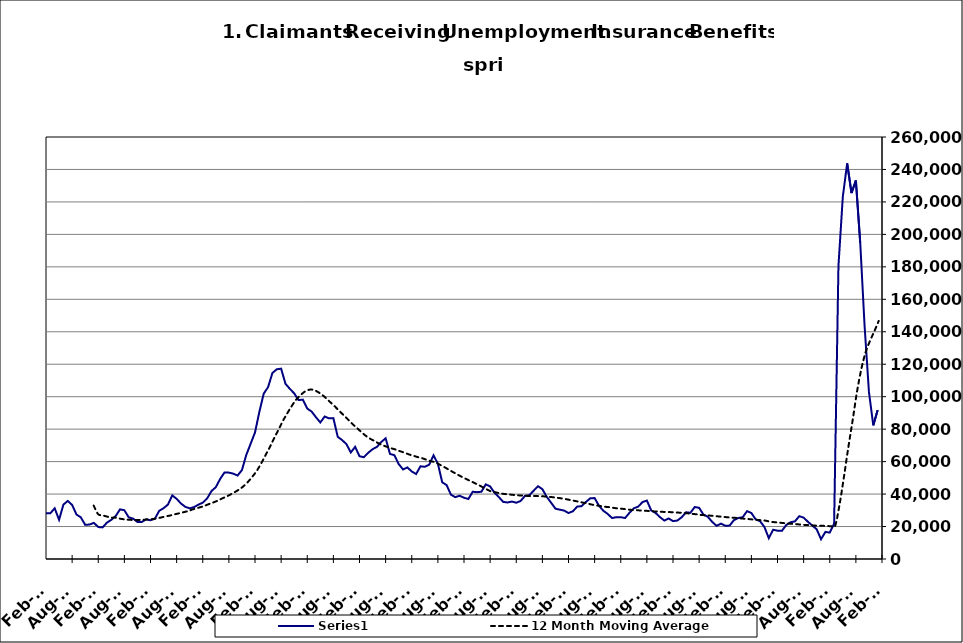
| Category | Series 0 |
|---|---|
| 2000-01-31 | 15239 |
| 2000-02-29 | 13995 |
| 2000-03-31 | 14536 |
| 2000-04-30 | 18337 |
| 2000-05-31 | 20863 |
| 2000-06-30 | 24310 |
| 2000-07-31 | 29359 |
| 2000-08-31 | 29764 |
| 2000-09-30 | 24540 |
| 2000-10-31 | 23067 |
| 2000-11-30 | 21129 |
| 2000-12-31 | 20288 |
| 2001-01-31 | 23646 |
| 2001-02-28 | 23782 |
| 2001-03-31 | 27047 |
| 2001-04-30 | 34048 |
| 2001-05-31 | 38168 |
| 2001-06-30 | 41894 |
| 2001-07-31 | 48114 |
| 2001-08-31 | 47646 |
| 2001-09-30 | 44132 |
| 2001-10-31 | 44465 |
| 2001-11-30 | 45928 |
| 2001-12-31 | 48930 |
| 2002-01-31 | 51864 |
| 2002-02-28 | 50778 |
| 2002-03-31 | 53014 |
| 2002-04-30 | 65394 |
| 2002-05-31 | 67925 |
| 2002-06-30 | 68727 |
| 2002-07-31 | 67269 |
| 2002-08-31 | 64233 |
| 2002-09-30 | 59955 |
| 2002-10-31 | 55535 |
| 2002-11-30 | 52233 |
| 2002-12-31 | 52252 |
| 2003-01-31 | 52694 |
| 2003-02-28 | 52578 |
| 2003-03-31 | 56236 |
| 2003-04-30 | 61020 |
| 2003-05-31 | 60584 |
| 2003-06-30 | 64980 |
| 2003-07-31 | 66426 |
| 2003-08-31 | 65403 |
| 2003-09-30 | 58348 |
| 2003-10-31 | 53953 |
| 2003-11-30 | 50453 |
| 2003-12-31 | 47799 |
| 2004-01-31 | 47134 |
| 2004-02-29 | 42441 |
| 2004-03-31 | 39363 |
| 2004-04-30 | 41157 |
| 2004-05-31 | 40892 |
| 2004-06-30 | 43601 |
| 2004-07-31 | 45411 |
| 2004-08-31 | 44738 |
| 2004-09-30 | 36049 |
| 2004-10-31 | 33551 |
| 2004-11-30 | 31386 |
| 2004-12-31 | 30195 |
| 2005-01-31 | 31661 |
| 2005-02-28 | 28205 |
| 2005-03-31 | 28194 |
| 2005-04-30 | 31233 |
| 2005-05-31 | 24184 |
| 2005-06-30 | 33525 |
| 2005-07-31 | 35776 |
| 2005-08-31 | 33297 |
| 2005-09-30 | 27423 |
| 2005-10-31 | 25647 |
| 2005-11-30 | 21039 |
| 2005-12-31 | 21238 |
| 2006-01-31 | 22270 |
| 2006-02-28 | 19689 |
| 2006-03-31 | 19474 |
| 2006-04-30 | 22420 |
| 2006-05-31 | 24146 |
| 2006-06-30 | 26450 |
| 2006-07-31 | 30575 |
| 2006-08-31 | 30038 |
| 2006-09-30 | 25657 |
| 2006-10-31 | 24869 |
| 2006-11-30 | 22832 |
| 2006-12-31 | 22826 |
| 2007-01-31 | 24459 |
| 2007-02-28 | 23856 |
| 2007-03-31 | 24786 |
| 2007-04-30 | 29690 |
| 2007-05-31 | 31303 |
| 2007-06-30 | 33512 |
| 2007-07-31 | 39176 |
| 2007-08-31 | 37077 |
| 2007-09-30 | 34179 |
| 2007-10-31 | 32130 |
| 2007-11-15 | 31205 |
| 2007-12-15 09:36:00 | 31973 |
| 2008-01-14 19:12:00 | 33494 |
| 2008-02-14 04:48:00 | 34694 |
| 2008-03-15 14:24:00 | 37279 |
| 2008-04-15 | 41840 |
| 2008-05-15 09:36:00 | 44245 |
| 2008-06-14 19:12:00 | 49341 |
| 2008-07-15 04:48:00 | 53353 |
| 2008-08-14 14:24:00 | 53222 |
| 2008-09-14 | 52594 |
| 2008-10-14 09:36:00 | 51417 |
| 2008-11-13 19:12:00 | 54795 |
| 2008-12-14 04:48:00 | 64139 |
| 2009-01-13 14:24:00 | 71026 |
| 2009-02-13 | 77947 |
| 2009-03-15 09:36:00 | 90649 |
| 2009-04-14 19:12:00 | 101865 |
| 2009-05-15 04:48:00 | 105867 |
| 2009-06-14 14:24:00 | 114626 |
| 2009-07-15 | 116882 |
| 2009-08-14 09:36:00 | 117270 |
| 2009-09-13 19:12:00 | 107943 |
| 2009-10-14 04:48:00 | 104849 |
| 2009-11-13 14:24:00 | 102065 |
| 2009-12-14 | 97917 |
| 2010-01-13 09:36:00 | 98175 |
| 2010-02-12 19:12:00 | 92691 |
| 2010-03-15 04:48:00 | 90832 |
| 2010-04-14 14:24:00 | 87347 |
| 2010-05-15 | 84120 |
| 2010-06-14 09:36:00 | 87787 |
| 2010-07-14 19:12:00 | 86654 |
| 2010-08-14 04:48:00 | 86789 |
| 2010-09-13 14:24:00 | 75317 |
| 2010-10-14 | 73259 |
| 2010-11-13 09:36:00 | 70783 |
| 2010-12-13 19:12:00 | 65644 |
| 2011-01-13 04:48:00 | 69106 |
| 2011-02-12 14:24:00 | 63322 |
| 2011-03-15 | 62724 |
| 2011-04-14 09:36:00 | 65434 |
| 2011-05-14 19:12:00 | 67641 |
| 2011-06-14 04:48:00 | 69087 |
| 2011-07-14 14:24:00 | 72082 |
| 2011-08-14 | 74376 |
| 2011-09-13 09:36:00 | 64739 |
| 2011-10-13 19:12:00 | 63965 |
| 2011-11-13 04:48:00 | 58496 |
| 2011-12-13 14:24:00 | 55173 |
| 2012-01-13 | 56418 |
| 2012-02-12 09:36:00 | 53942 |
| 2012-03-13 19:12:00 | 52352 |
| 2012-04-13 04:48:00 | 57118 |
| 2012-05-13 14:24:00 | 56827 |
| 2012-06-13 | 58115 |
| 2012-07-13 09:36:00 | 63863 |
| 2012-08-12 19:12:00 | 58706 |
| 2012-09-12 04:48:00 | 47243 |
| 2012-10-12 14:24:00 | 45567 |
| 2012-11-12 | 39623 |
| 2012-12-12 09:36:00 | 38101 |
| 2013-01-11 19:12:00 | 38966 |
| 2013-02-11 04:48:00 | 37746 |
| 2013-03-13 14:24:00 | 36956 |
| 2013-04-13 | 41439 |
| 2013-05-13 09:36:00 | 41162 |
| 2013-06-12 19:12:00 | 41455 |
| 2013-07-13 04:48:00 | 45989 |
| 2013-08-12 14:24:00 | 44712 |
| 2013-09-12 | 40828 |
| 2013-10-12 09:36:00 | 38185 |
| 2013-11-11 19:12:00 | 35184 |
| 2013-12-12 04:48:00 | 34824 |
| 2014-01-11 14:24:00 | 35396 |
| 2014-02-11 | 34683 |
| 2014-03-13 09:36:00 | 35748 |
| 2014-04-12 19:12:00 | 38892 |
| 2014-05-13 04:48:00 | 39325 |
| 2014-06-12 14:24:00 | 42091 |
| 2014-07-13 | 44842 |
| 2014-08-14 | 43016 |
| 2014-09-13 09:36:00 | 38304 |
| 2014-10-13 19:12:00 | 34708 |
| 2014-11-13 04:48:00 | 31017 |
| 2014-12-13 14:24:00 | 30402 |
| 2015-01-13 | 29823 |
| 2015-02-12 09:36:00 | 28333 |
| 2015-03-14 19:12:00 | 29389 |
| 2015-04-14 04:48:00 | 32293 |
| 2015-05-14 14:24:00 | 32538 |
| 2015-06-14 | 35137 |
| 2015-07-14 09:36:00 | 37398 |
| 2015-08-13 19:12:00 | 37536 |
| 2015-09-13 04:48:00 | 32808 |
| 2015-10-13 14:24:00 | 29728 |
| 2015-11-13 | 27775 |
| 2015-12-13 09:36:00 | 25227 |
| 2016-01-12 19:12:00 | 25773 |
| 2016-02-12 04:48:00 | 25758 |
| 2016-03-13 14:24:00 | 25247 |
| 2016-04-13 | 28463 |
| 2016-05-13 09:36:00 | 31210 |
| 2016-06-12 19:12:00 | 32255 |
| 2016-07-13 04:48:00 | 35088 |
| 2016-08-12 14:24:00 | 36018 |
| 2016-09-12 | 29922 |
| 2016-10-12 09:36:00 | 28368 |
| 2016-11-11 19:12:00 | 25818 |
| 2016-12-12 04:48:00 | 23690 |
| 2017-01-11 14:24:00 | 24964 |
| 2017-02-11 | 23348 |
| 2017-03-13 09:36:00 | 23685 |
| 2017-04-12 19:12:00 | 25733 |
| 2017-05-13 04:48:00 | 28796 |
| 2017-06-12 14:24:00 | 28489 |
| 2017-07-13 | 32034 |
| 2017-08-12 09:36:00 | 31539 |
| 2017-09-11 19:12:00 | 27321 |
| 2017-10-12 04:48:00 | 25990 |
| 2017-11-11 14:24:00 | 22875 |
| 2017-12-12 | 20445 |
| 2018-01-11 09:36:00 | 21794 |
| 2018-02-10 19:12:00 | 20475 |
| 2018-03-13 04:48:00 | 20585 |
| 2018-04-12 14:24:00 | 23969 |
| 2018-05-13 | 25280 |
| 2018-06-12 09:36:00 | 25741 |
| 2018-07-12 19:12:00 | 29479 |
| 2018-08-12 04:48:00 | 28351 |
| 2018-09-11 14:24:00 | 24386 |
| 2018-10-12 | 23292 |
| 2018-11-11 09:36:00 | 19711 |
| 2018-12-11 19:12:00 | 12853 |
| 2019-01-11 04:48:00 | 18039 |
| 2019-02-10 14:24:00 | 17466 |
| 2019-03-13 | 17325 |
| 2019-04-12 09:36:00 | 20890 |
| 2019-05-12 19:12:00 | 22641 |
| 2019-06-12 04:48:00 | 23178 |
| 2019-07-12 14:24:00 | 26385 |
| 2019-08-12 | 25501 |
| 2019-09-11 09:36:00 | 22892 |
| 2019-10-11 19:12:00 | 20585 |
| 2019-11-11 04:48:00 | 18323 |
| 2019-12-11 14:24:00 | 12174 |
| 2020-01-11 | 16684 |
| 2020-02-10 09:36:00 | 16260 |
| 2020-03-11 19:12:00 | 21667 |
| 2020-04-11 04:48:00 | 180666 |
| 2020-05-11 14:24:00 | 223189 |
| 2020-06-11 | 243809 |
| 2020-07-11 09:36:00 | 225469 |
| 2020-08-10 19:12:00 | 233220 |
| 2020-09-10 04:48:00 | 194839 |
| 2020-10-10 14:24:00 | 143722 |
| 2020-11-10 | 102967 |
| 2020-12-10 09:36:00 | 82367 |
| 2021-01-09 19:12:00 | 91726 |
| 2021-02-09 04:48:00 | 85418 |